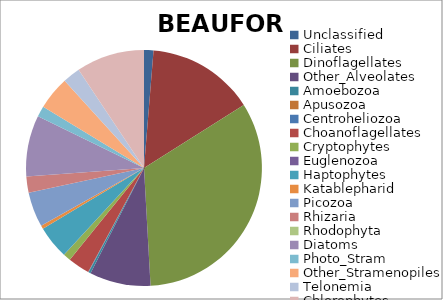
| Category | BEAUFORT |
|---|---|
| Unclassified | 0.013 |
| Ciliates | 0.147 |
| Dinoflagellates | 0.331 |
| Other_Alveolates | 0.084 |
| Amoebozoa | 0.003 |
| Apusozoa | 0 |
| Centroheliozoa | 0.001 |
| Choanoflagellates | 0.03 |
| Cryptophytes | 0.01 |
| Euglenozoa | 0 |
| Haptophytes | 0.045 |
| Katablepharid | 0.005 |
| Picozoa | 0.048 |
| Rhizaria | 0.022 |
| Rhodophyta | 0 |
| Diatoms | 0.084 |
| Photo_Stram | 0.015 |
| Other_Stramenopiles | 0.046 |
| Telonemia | 0.024 |
| Chlorophytes | 0.094 |